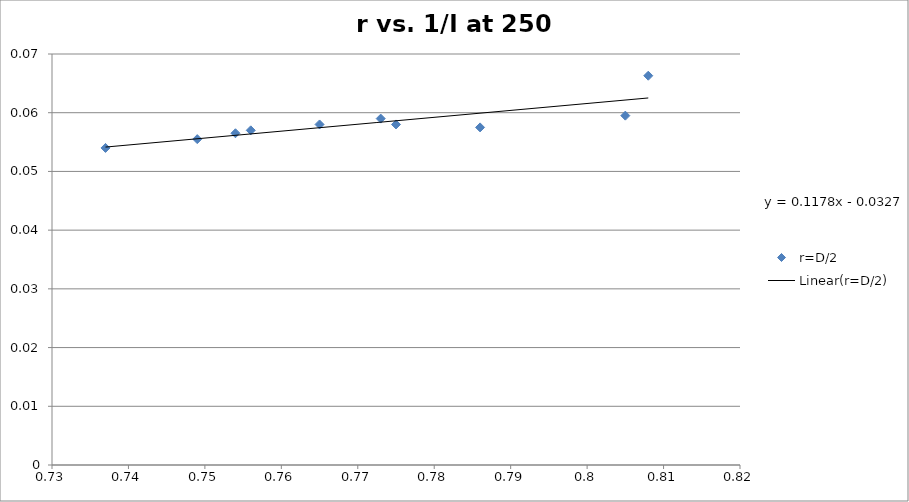
| Category | r=D/2 |
|---|---|
| 0.805 | 0.06 |
| 0.775 | 0.058 |
| 0.765 | 0.058 |
| 0.737 | 0.054 |
| 0.808 | 0.066 |
| 0.786 | 0.058 |
| 0.754 | 0.056 |
| 0.749 | 0.056 |
| 0.773 | 0.059 |
| 0.756 | 0.057 |